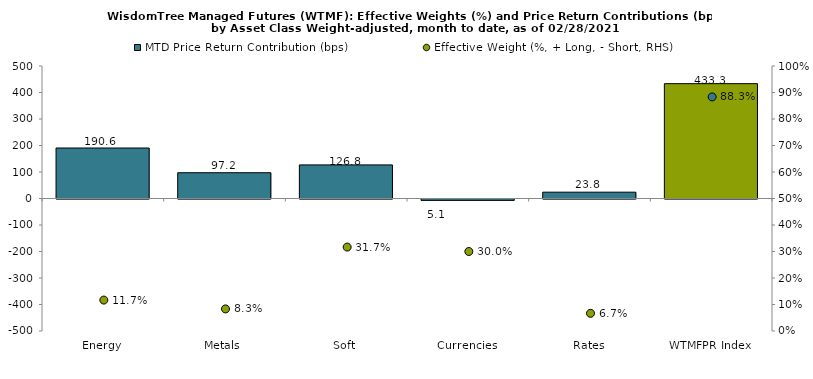
| Category | MTD Price Return Contribution (bps) |
|---|---|
| Energy | 190.563 |
| Metals | 97.243 |
| Soft | 126.816 |
| Currencies | -5.143 |
| Rates | 23.849 |
| WTMFPR Index | 433.328 |